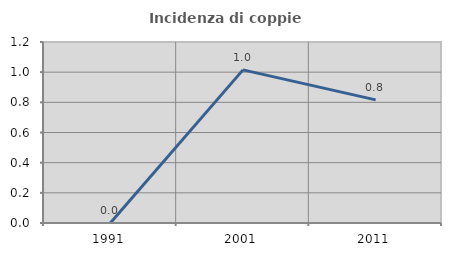
| Category | Incidenza di coppie miste |
|---|---|
| 1991.0 | 0 |
| 2001.0 | 1.015 |
| 2011.0 | 0.816 |